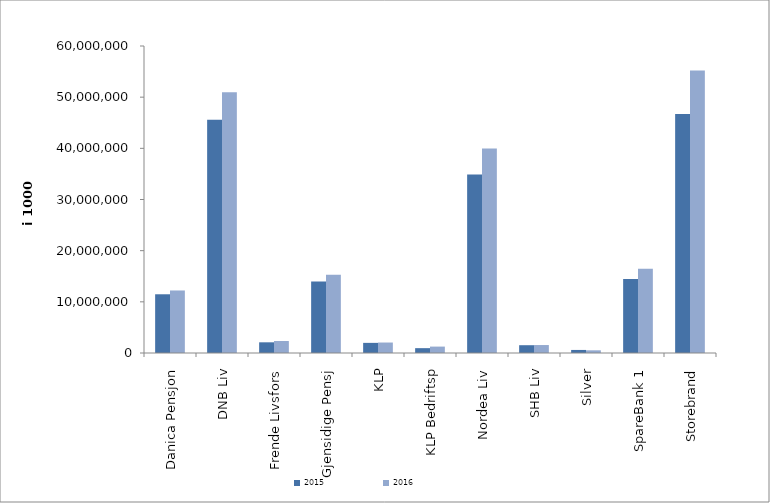
| Category | 2015 | 2016 |
|---|---|---|
| 0 | 11477606.638 | 12219937.159 |
| 1 | 45606542 | 50966960.75 |
| 2 | 2088707 | 2340738 |
| 3 | 13975440.982 | 15287381.192 |
| 4 | 1980338.339 | 2046847.926 |
| 5 | 946634 | 1251557 |
| 6 | 34891610.6 | 39964500 |
| 7 | 1523752 | 1556437 |
| 8 | 596416.454 | 524253.462 |
| 9 | 14447433.174 | 16453474.357 |
| 10 | 46716734.162 | 55234944.389 |